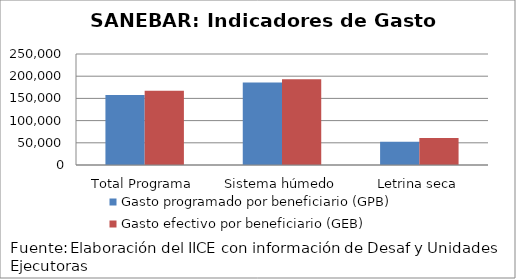
| Category | Gasto programado por beneficiario (GPB)  | Gasto efectivo por beneficiario (GEB)  |
|---|---|---|
| Total Programa | 157894.737 | 167234.368 |
| Sistema húmedo | 186000 | 192976.13 |
| Letrina seca | 52500 | 61039.755 |